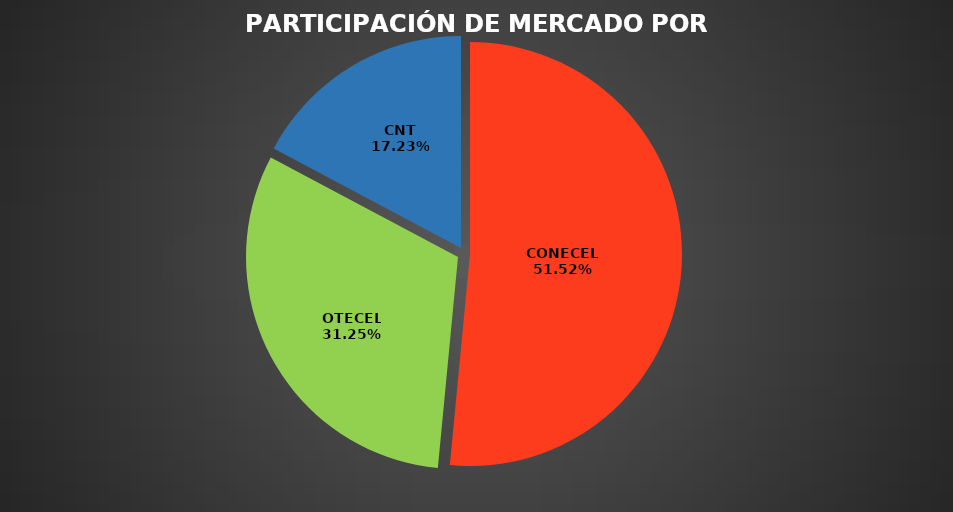
| Category | Nov 2022 |
|---|---|
| CONECEL | 8959736 |
| OTECEL | 5435623 |
| CNT | 2996586 |